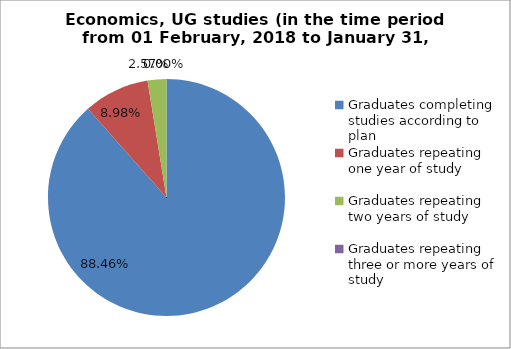
| Category | Series 0 |
|---|---|
| Graduates completing studies according to plan | 88.462 |
| Graduates repeating one year of study | 8.974 |
| Graduates repeating two years of study | 2.564 |
| Graduates repeating three or more years of study | 0 |